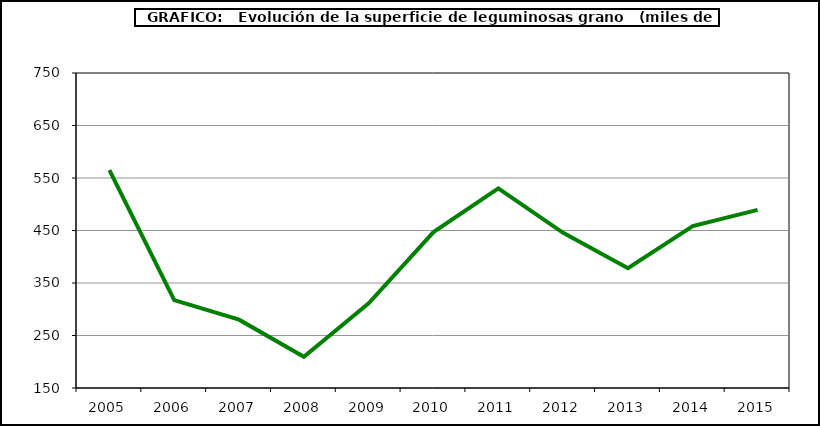
| Category | Superficie |
|---|---|
| 2005.0 | 564.942 |
| 2006.0 | 317.542 |
| 2007.0 | 280.112 |
| 2008.0 | 209.361 |
| 2009.0 | 311.119 |
| 2010.0 | 446.981 |
| 2011.0 | 530.29 |
| 2012.0 | 445.63 |
| 2013.0 | 378.113 |
| 2014.0 | 458.381 |
| 2015.0 | 489.39 |